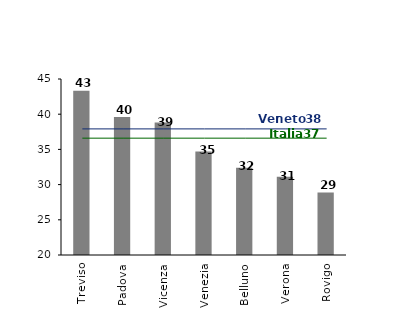
| Category | euro |
|---|---|
| Treviso | 43322.402 |
| Padova | 39588.858 |
| Vicenza | 38810.452 |
| Venezia | 34710.273 |
| Belluno | 32395.843 |
| Verona | 31128.107 |
| Rovigo | 28861.213 |